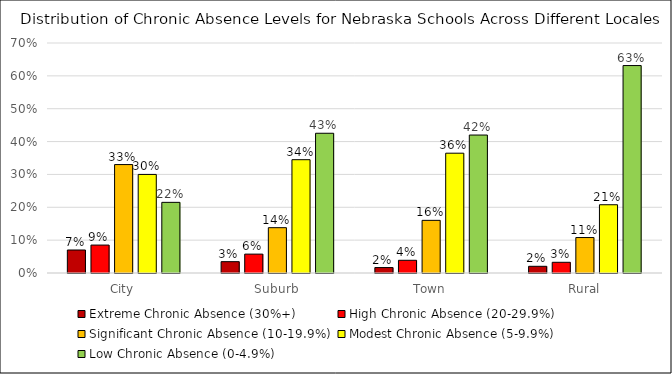
| Category | Extreme Chronic Absence (30%+) | High Chronic Absence (20-29.9%) | Significant Chronic Absence (10-19.9%) | Modest Chronic Absence (5-9.9%) | Low Chronic Absence (0-4.9%) |
|---|---|---|---|---|---|
| City | 0.07 | 0.085 | 0.33 | 0.3 | 0.215 |
| Suburb | 0.034 | 0.057 | 0.138 | 0.345 | 0.425 |
| Town | 0.017 | 0.039 | 0.16 | 0.365 | 0.42 |
| Rural | 0.02 | 0.033 | 0.108 | 0.208 | 0.631 |